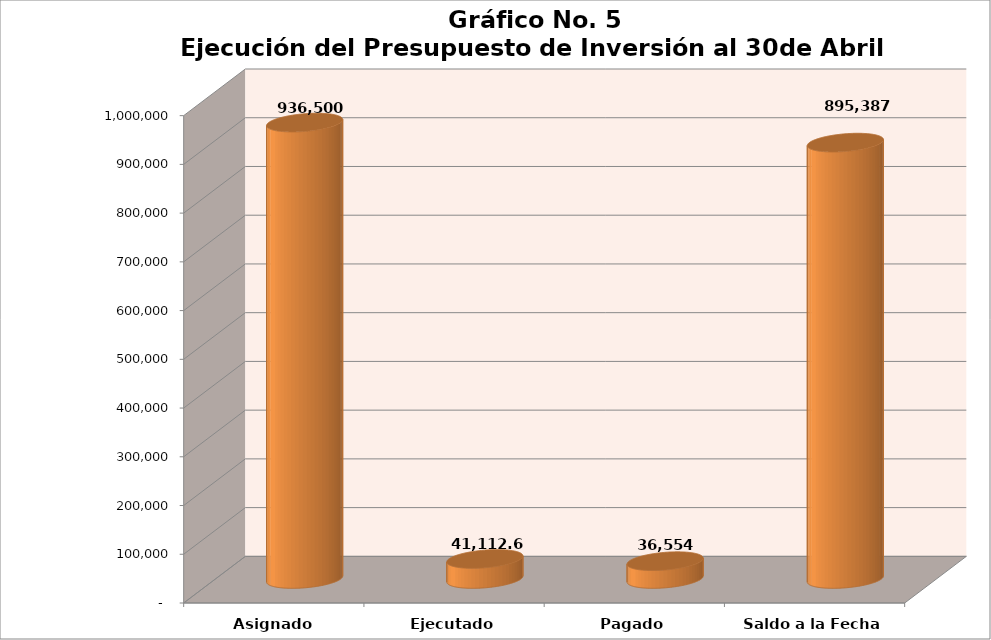
| Category | Series 0 |
|---|---|
| Asignado | 936500 |
| Ejecutado | 41112.66 |
| Pagado | 36553.98 |
| Saldo a la Fecha | 895387.34 |